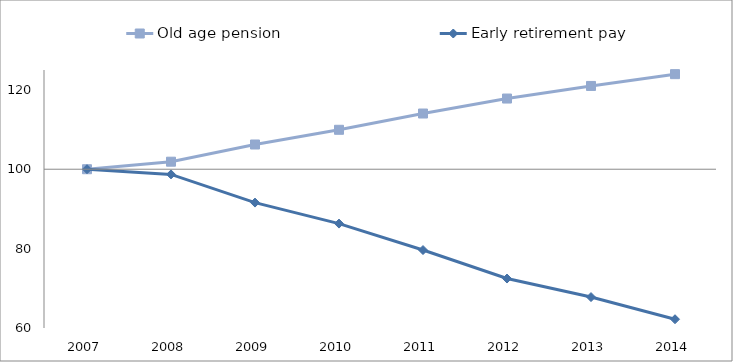
| Category | Old age pension | Early retirement pay | 0 |
|---|---|---|---|
| 2007.0 | 100 | 100 |  |
| 2008.0 | 101.899 | 98.701 |  |
| 2009.0 | 106.234 | 91.597 |  |
| 2010.0 | 109.938 | 86.306 |  |
| 2011.0 | 114.033 | 79.638 |  |
| 2012.0 | 117.81 | 72.462 |  |
| 2013.0 | 120.983 | 67.79 |  |
| 2014.0 | 123.954 | 62.206 |  |